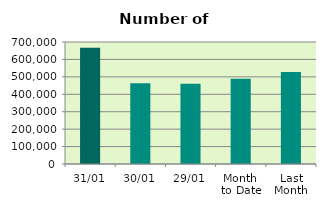
| Category | Series 0 |
|---|---|
| 31/01 | 666624 |
| 30/01 | 463390 |
| 29/01 | 460308 |
| Month 
to Date | 488780.727 |
| Last
Month | 528134.632 |